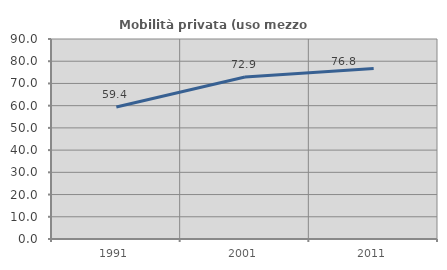
| Category | Mobilità privata (uso mezzo privato) |
|---|---|
| 1991.0 | 59.438 |
| 2001.0 | 72.863 |
| 2011.0 | 76.777 |